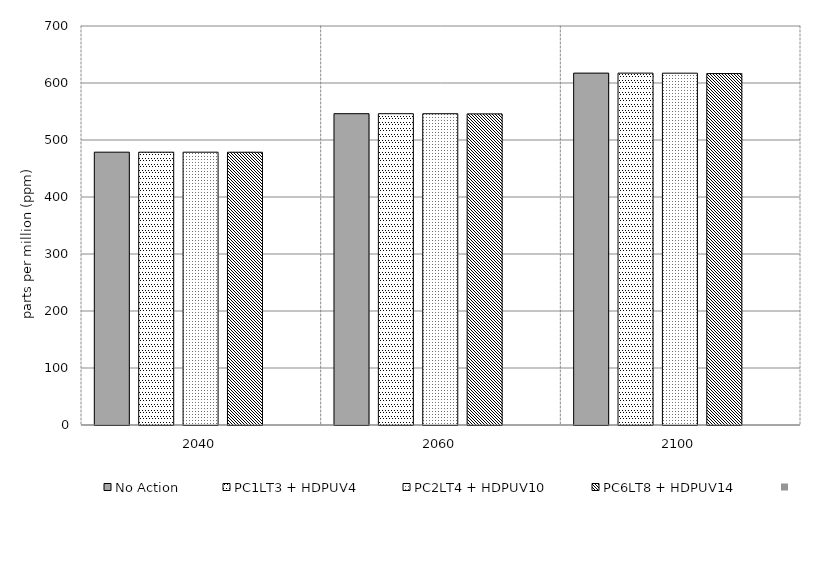
| Category | No Action | PC1LT3 + HDPUV4 | PC2LT4 + HDPUV10 | PC6LT8 + HDPUV14 | Series 4 | Alt 5 | Alt 6 | Alt 7 | Alt 8 | Alt 10 |
|---|---|---|---|---|---|---|---|---|---|---|
| 2040.0 | 478.623 | 478.612 | 478.606 | 478.532 |  |  |  |  |  |  |
| 2060.0 | 546.168 | 546.149 | 546.117 | 545.808 |  |  |  |  |  |  |
| 2100.0 | 617.328 | 617.303 | 617.223 | 616.517 |  |  |  |  |  |  |